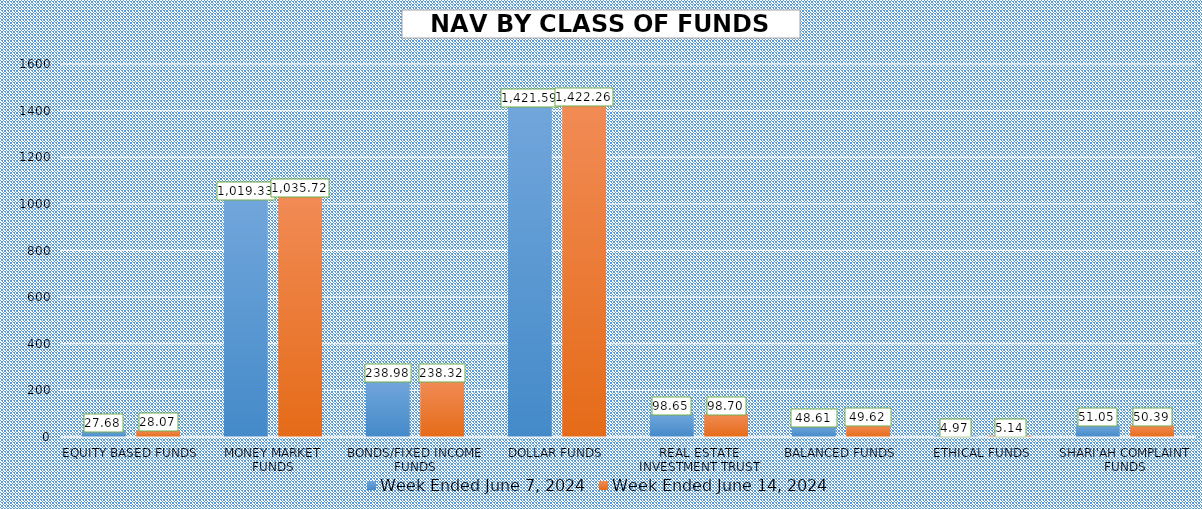
| Category | Week Ended June 7, 2024 | Week Ended June 14, 2024 |
|---|---|---|
| EQUITY BASED FUNDS | 27.685 | 28.068 |
| MONEY MARKET FUNDS | 1019.332 | 1035.719 |
| BONDS/FIXED INCOME FUNDS | 238.985 | 238.319 |
| DOLLAR FUNDS | 1421.593 | 1422.261 |
| REAL ESTATE INVESTMENT TRUST | 98.65 | 98.697 |
| BALANCED FUNDS | 48.611 | 49.622 |
| ETHICAL FUNDS | 4.968 | 5.139 |
| SHARI'AH COMPLAINT FUNDS | 51.055 | 50.386 |